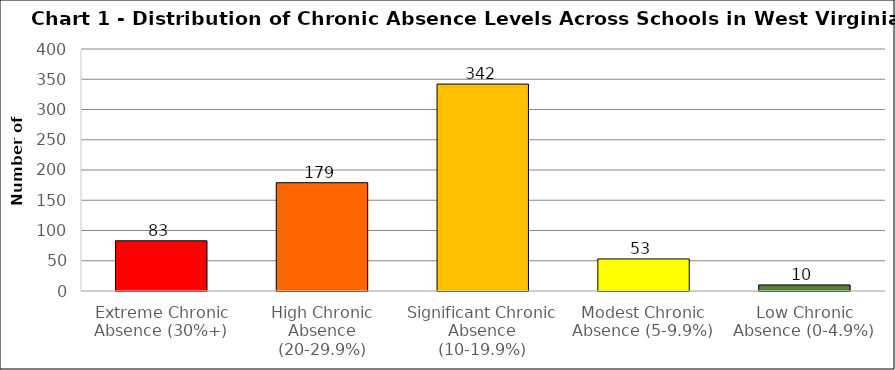
| Category | Series 0 |
|---|---|
| Extreme Chronic Absence (30%+) | 83 |
| High Chronic Absence (20-29.9%) | 179 |
| Significant Chronic Absence (10-19.9%) | 342 |
| Modest Chronic Absence (5-9.9%) | 53 |
| Low Chronic Absence (0-4.9%) | 10 |